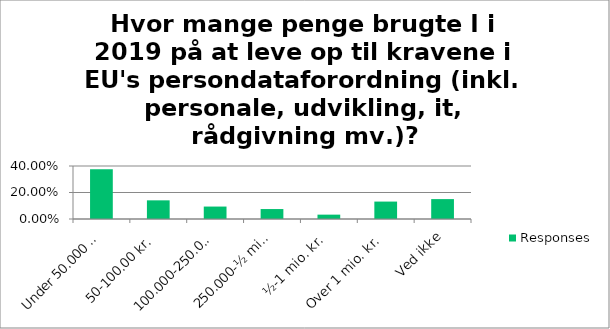
| Category | Responses |
|---|---|
| Under 50.000 kr. | 0.376 |
| 50-100.00 kr. | 0.141 |
| 100.000-250.000 kr. | 0.094 |
| 250.000-½ mio. kr. | 0.075 |
| ½-1 mio. kr. | 0.033 |
| Over 1 mio. kr. | 0.132 |
| Ved ikke | 0.15 |